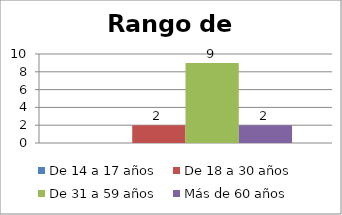
| Category | De 14 a 17 años | De 18 a 30 años  | De 31 a 59 años  | Más de 60 años  |
|---|---|---|---|---|
| 0 |  | 2 | 9 | 2 |